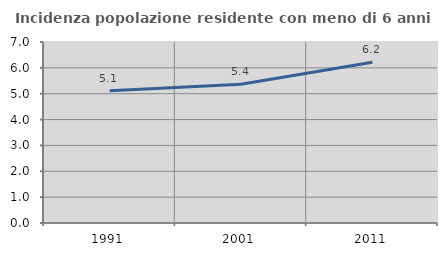
| Category | Incidenza popolazione residente con meno di 6 anni |
|---|---|
| 1991.0 | 5.119 |
| 2001.0 | 5.369 |
| 2011.0 | 6.219 |